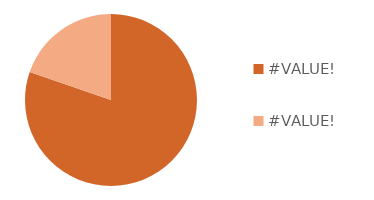
| Category | Series 0 |
|---|---|
| 0.0 | 2810 |
| 0.0 | 690 |